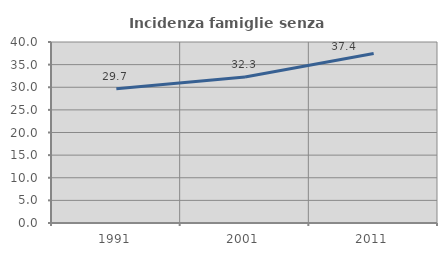
| Category | Incidenza famiglie senza nuclei |
|---|---|
| 1991.0 | 29.668 |
| 2001.0 | 32.278 |
| 2011.0 | 37.444 |